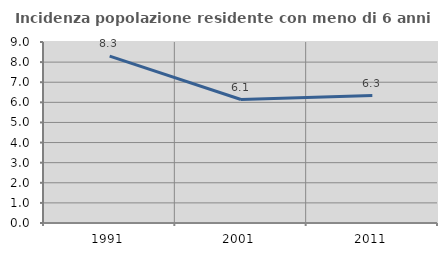
| Category | Incidenza popolazione residente con meno di 6 anni |
|---|---|
| 1991.0 | 8.297 |
| 2001.0 | 6.14 |
| 2011.0 | 6.337 |